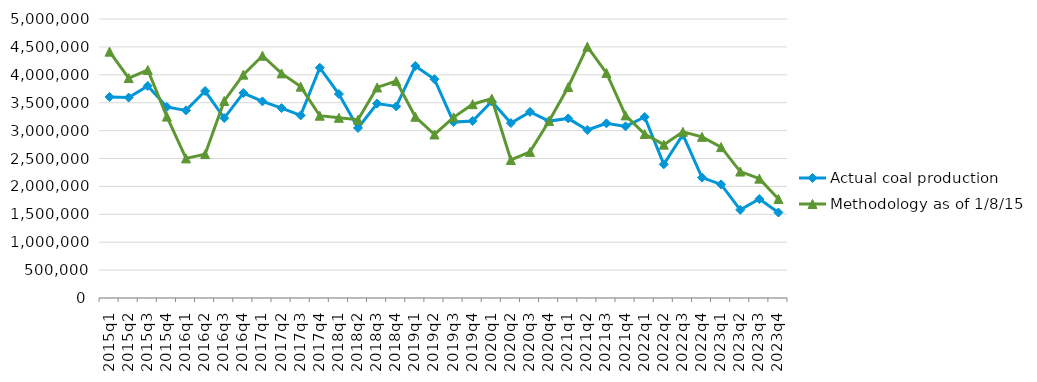
| Category | Actual coal production | Methodology as of 1/8/15 |
|---|---|---|
| 2015q1 | 3603389 | 4414432 |
| 2015q2 | 3591874 | 3941426 |
| 2015q3 | 3799807 | 4086087 |
| 2015q4 | 3424008 | 3250474 |
| 2016q1 | 3362445 | 2502055 |
| 2016q2 | 3709491 | 2577895 |
| 2016q3 | 3224816 | 3531701 |
| 2016q4 | 3673182 | 4002693 |
| 2017q1 | 3523283 | 4341705 |
| 2017q2 | 3403444 | 4025429 |
| 2017q3 | 3272402 | 3787845 |
| 2017q4 | 4126608 | 3266976 |
| 2018q1 | 3655647 | 3229737 |
| 2018q2 | 3046699 | 3194167 |
| 2018q3 | 3483726 | 3773728 |
| 2018q4 | 3432630 | 3887995 |
| 2019q1 | 4158064 | 3248219 |
| 2019q2 | 3921770 | 2930531 |
| 2019q3 | 3152347 | 3237736 |
| 2019q4 | 3173179 | 3473366 |
| 2020q1 | 3521267 | 3572672 |
| 2020q2 | 3135730 | 2473592 |
| 2020q3 | 3335642 | 2618247 |
| 2020q4 | 3170468 | 3170468 |
| 2021q1 | 3218660 | 3781088 |
| 2021q2 | 3010043 | 4503429 |
| 2021q3 | 3129724 | 4033088 |
| 2021q4 | 3075404 | 3272144 |
| 2022q1 | 3244543 | 2939196 |
| 2022q2 | 2394996 | 2747731 |
| 2022q3 | 2925950 | 2978047 |
| 2022q4 | 2157783 | 2888100 |
| 2023q1 | 2035031 | 2704667 |
| 2023q2 | 1579954 | 2266051 |
| 2023q3 | 1773877 | 2138934 |
| 2023q4 | 1531712 | 1774858 |